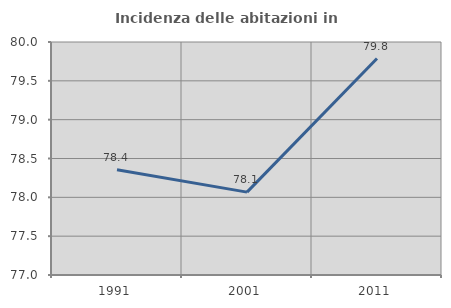
| Category | Incidenza delle abitazioni in proprietà  |
|---|---|
| 1991.0 | 78.355 |
| 2001.0 | 78.067 |
| 2011.0 | 79.787 |